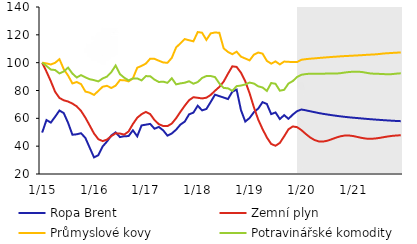
| Category | Ropa Brent | Zemní plyn | Průmyslové kovy | Potravinářské komodity |
|---|---|---|---|---|
|  1/15 | 49.758 | 100 | 100 | 100 |
| 2 | 58.795 | 93.587 | 99.447 | 97.61 |
| 3 | 56.939 | 86.683 | 98.693 | 95.043 |
| 4 | 61.136 | 79.043 | 99.909 | 94.708 |
| 5 | 65.609 | 74.666 | 102.511 | 92.252 |
| 6 | 63.753 | 72.949 | 95.305 | 93.666 |
| 7 | 56.764 | 72.072 | 90.715 | 96.445 |
| 8 | 48.206 | 70.601 | 85.084 | 92.155 |
| 9 | 48.54 | 68.591 | 86.114 | 89.356 |
| 10 | 49.293 | 65.314 | 84.586 | 91.06 |
| 11 | 45.932 | 60.5 | 79.257 | 89.434 |
| 12 | 38.904 | 54.867 | 78.434 | 88.105 |
|  1/16 | 31.926 | 49.108 | 76.848 | 87.452 |
| 2 | 33.527 | 45.013 | 79.703 | 86.547 |
| 3 | 39.79 | 43.643 | 82.692 | 88.65 |
| 4 | 43.34 | 44.699 | 83.376 | 89.984 |
| 5 | 47.647 | 47.228 | 81.811 | 93.168 |
| 6 | 49.927 | 49.233 | 83.482 | 97.947 |
| 7 | 46.535 | 49.096 | 87.466 | 91.753 |
| 8 | 47.159 | 48.301 | 87.426 | 89.188 |
| 9 | 47.24 | 50.589 | 86.546 | 87.268 |
| 10 | 51.388 | 55.926 | 88.713 | 88.629 |
| 11 | 47.079 | 60.421 | 96.356 | 88.705 |
| 12 | 54.916 | 62.973 | 97.676 | 87.26 |
|  1/17 | 55.448 | 64.621 | 99.349 | 90.348 |
| 2 | 55.996 | 63.025 | 102.875 | 90.261 |
| 3 | 52.539 | 58.736 | 102.74 | 87.811 |
| 4 | 53.819 | 55.798 | 101.399 | 86.112 |
| 5 | 51.39 | 54.498 | 100.17 | 86.362 |
| 6 | 47.554 | 54.411 | 99.885 | 85.51 |
| 7 | 49.149 | 56.249 | 103.485 | 88.802 |
| 8 | 51.87 | 60.081 | 110.967 | 84.404 |
| 9 | 55.515 | 64.703 | 113.902 | 85.12 |
| 10 | 57.649 | 69.083 | 116.948 | 85.594 |
| 11 | 62.866 | 73.02 | 116.113 | 86.634 |
| 12 | 64.092 | 75.179 | 115.333 | 84.884 |
|  1/18 | 69.079 | 74.765 | 121.995 | 86.058 |
| 2 | 65.73 | 74.31 | 121.52 | 88.987 |
| 3 | 66.72 | 74.807 | 116.383 | 90.396 |
| 4 | 71.762 | 76.83 | 121.054 | 90.402 |
| 5 | 77.007 | 79.814 | 121.7 | 89.631 |
| 6 | 75.941 | 82.558 | 121.455 | 85.084 |
| 7 | 74.952 | 86.406 | 110.297 | 81.836 |
| 8 | 73.842 | 92.054 | 107.71 | 81.576 |
| 9 | 79.11 | 97.36 | 106.076 | 79.731 |
| 10 | 80.63 | 96.966 | 107.899 | 83.137 |
| 11 | 65.949 | 92.833 | 104.332 | 83.564 |
| 12 | 57.674 | 86.601 | 103 | 84.318 |
|  1/19 | 60.241 | 78.008 | 101.636 | 85.695 |
| 2 | 64.432 | 67.932 | 105.768 | 85.01 |
| 3 | 67.028 | 59.069 | 107.285 | 83.005 |
| 4 | 71.629 | 52.265 | 106.48 | 82.161 |
| 5 | 70.303 | 46.249 | 101.269 | 79.693 |
| 6 | 63.038 | 41.584 | 99.317 | 85.393 |
| 7 | 64.215 | 40.305 | 100.898 | 84.823 |
| 8 | 59.502 | 42.334 | 98.74 | 79.868 |
| 9 | 62.287 | 47.09 | 100.797 | 80.494 |
| 10 | 59.632 | 52.121 | 100.585 | 85.025 |
| 11 | 62.71 | 54.174 | 100.505 | 86.782 |
| 12 | 65.174 | 53.644 | 100.46 | 89.747 |
|  1/20 | 66.355 | 51.51 | 102.093 | 91.316 |
| 2 | 65.762 | 48.791 | 102.517 | 91.795 |
| 3 | 65.095 | 46.301 | 102.835 | 92.101 |
| 4 | 64.45 | 44.452 | 103.071 | 92.049 |
| 5 | 63.8 | 43.419 | 103.367 | 91.952 |
| 6 | 63.244 | 43.312 | 103.616 | 92.055 |
| 7 | 62.752 | 43.911 | 103.861 | 92.199 |
| 8 | 62.284 | 44.981 | 104.112 | 92.196 |
| 9 | 61.853 | 46.12 | 104.317 | 92.157 |
| 10 | 61.436 | 47.075 | 104.545 | 92.443 |
| 11 | 61.077 | 47.624 | 104.731 | 92.902 |
| 12 | 60.739 | 47.664 | 104.892 | 93.281 |
|  1/21 | 60.444 | 47.25 | 105.049 | 93.503 |
| 2 | 60.18 | 46.577 | 105.218 | 93.531 |
| 3 | 59.899 | 45.897 | 105.398 | 93.287 |
| 4 | 59.622 | 45.428 | 105.606 | 92.745 |
| 5 | 59.365 | 45.288 | 105.783 | 92.21 |
| 6 | 59.127 | 45.478 | 105.951 | 92.048 |
| 7 | 58.901 | 45.908 | 106.211 | 91.945 |
| 8 | 58.687 | 46.448 | 106.604 | 91.811 |
| 9 | 58.482 | 46.971 | 106.787 | 91.622 |
| 10 | 58.281 | 47.393 | 107 | 91.786 |
| 11 | 58.113 | 47.677 | 107.178 | 92.119 |
| 12 | 57.96 | 47.844 | 107.355 | 92.366 |